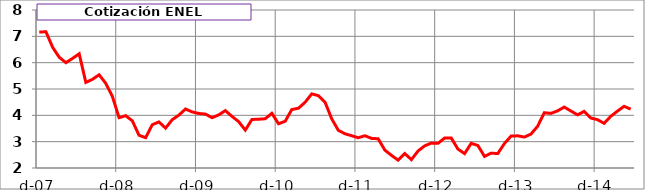
| Category | ENEL |
|---|---|
| 2007-12-01 | 7.167 |
| 2008-01-01 | 7.171 |
| 2008-02-01 | 6.585 |
| 2008-03-01 | 6.206 |
| 2008-04-01 | 5.999 |
| 2008-05-01 | 6.162 |
| 2008-06-01 | 6.338 |
| 2008-07-01 | 5.249 |
| 2008-08-01 | 5.368 |
| 2008-09-01 | 5.54 |
| 2008-10-01 | 5.214 |
| 2008-11-01 | 4.716 |
| 2008-12-01 | 3.912 |
| 2009-01-01 | 3.987 |
| 2009-02-01 | 3.79 |
| 2009-03-01 | 3.244 |
| 2009-04-01 | 3.151 |
| 2009-05-01 | 3.643 |
| 2009-06-01 | 3.75 |
| 2009-07-01 | 3.515 |
| 2009-08-01 | 3.835 |
| 2009-09-01 | 4.008 |
| 2009-10-01 | 4.24 |
| 2009-11-01 | 4.13 |
| 2009-12-01 | 4.07 |
| 2010-01-01 | 4.048 |
| 2010-02-01 | 3.91 |
| 2010-03-01 | 4.018 |
| 2010-04-01 | 4.18 |
| 2010-05-01 | 3.96 |
| 2010-06-01 | 3.76 |
| 2010-07-01 | 3.44 |
| 2010-08-01 | 3.843 |
| 2010-09-01 | 3.852 |
| 2010-10-01 | 3.87 |
| 2010-11-01 | 4.078 |
| 2010-12-01 | 3.68 |
| 2011-01-01 | 3.775 |
| 2011-02-01 | 4.22 |
| 2011-03-01 | 4.27 |
| 2011-04-01 | 4.496 |
| 2011-05-01 | 4.816 |
| 2011-06-01 | 4.746 |
| 2011-07-01 | 4.5 |
| 2011-08-01 | 3.87 |
| 2011-09-01 | 3.43 |
| 2011-10-01 | 3.3 |
| 2011-11-01 | 3.226 |
| 2011-12-01 | 3.148 |
| 2012-01-01 | 3.226 |
| 2012-02-01 | 3.124 |
| 2012-03-01 | 3.11 |
| 2012-04-01 | 2.68 |
| 2012-05-01 | 2.48 |
| 2012-06-01 | 2.298 |
| 2012-07-01 | 2.548 |
| 2012-08-01 | 2.318 |
| 2012-09-01 | 2.646 |
| 2012-10-01 | 2.842 |
| 2012-11-01 | 2.946 |
| 2012-12-01 | 2.936 |
| 2013-01-01 | 3.138 |
| 2013-02-01 | 3.136 |
| 2013-03-01 | 2.72 |
| 2013-04-01 | 2.546 |
| 2013-05-01 | 2.936 |
| 2013-06-01 | 2.856 |
| 2013-07-01 | 2.44 |
| 2013-08-01 | 2.564 |
| 2013-09-01 | 2.548 |
| 2013-10-01 | 2.93 |
| 2013-11-01 | 3.212 |
| 2013-12-01 | 3.222 |
| 2014-01-01 | 3.174 |
| 2014-02-01 | 3.29 |
| 2014-03-01 | 3.586 |
| 2014-04-01 | 4.1 |
| 2014-05-01 | 4.074 |
| 2014-06-01 | 4.17 |
| 2014-07-01 | 4.314 |
| 2014-08-01 | 4.164 |
| 2014-09-01 | 4.018 |
| 2014-10-01 | 4.15 |
| 2014-11-01 | 3.898 |
| 2014-12-01 | 3.836 |
| 2015-01-01 | 3.696 |
| 2015-02-01 | 3.962 |
| 2015-03-01 | 4.158 |
| 2015-04-01 | 4.342 |
| 2015-05-01 | 4.236 |